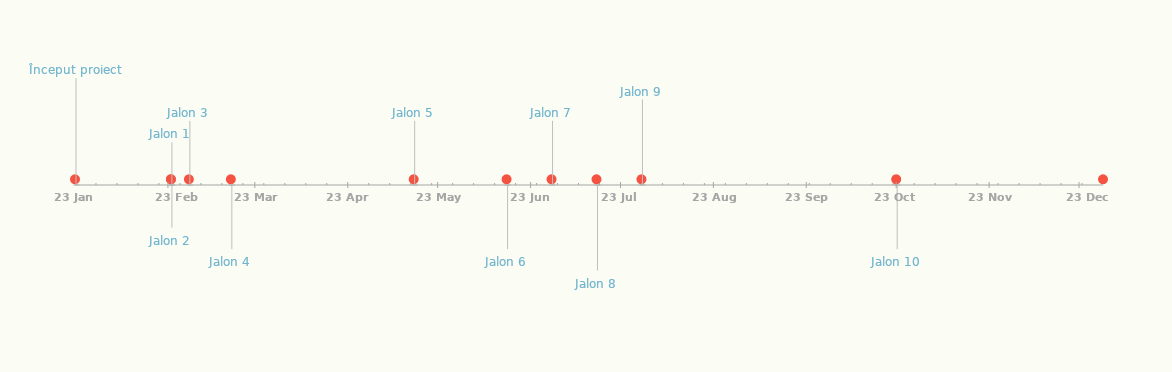
| Category | POZIȚIE |
|---|---|
| Început proiect | 25 |
| Jalon 1 | 10 |
| Jalon 2 | -10 |
| Jalon 3 | 15 |
| Jalon 4 | -15 |
| Jalon 5 | 15 |
| Jalon 6 | -15 |
| Jalon 7 | 15 |
| Jalon 8 | -20 |
| Jalon 9 | 20 |
| Jalon 10 | -15 |
| Sfârșit proiect | 15 |